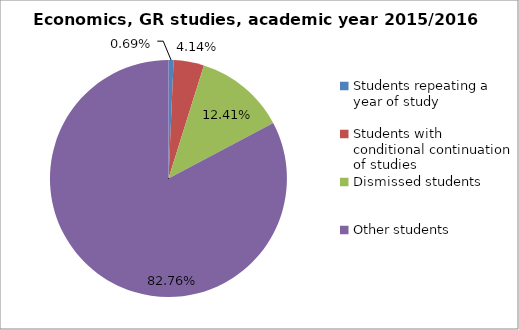
| Category | Series 0 |
|---|---|
| Students repeating a year of study | 1 |
| Students with conditional continuation of studies | 6 |
| Dismissed students | 18 |
| Other students | 120 |